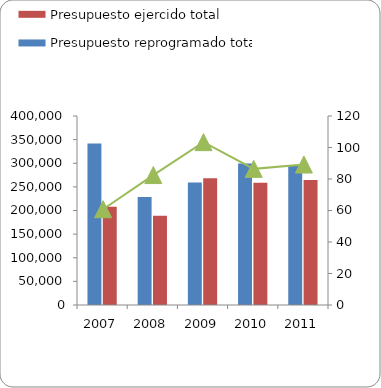
| Category | Presupuesto reprogramado total | Presupuesto ejercido total |
|---|---|---|
| 2007 | 341986 | 207984 |
| 2008 | 228687.2 | 188677.7 |
| 2009 | 259279 | 268119 |
| 2010 | 299481 | 258863 |
| 2011 | 296437.9 | 264391.5 |